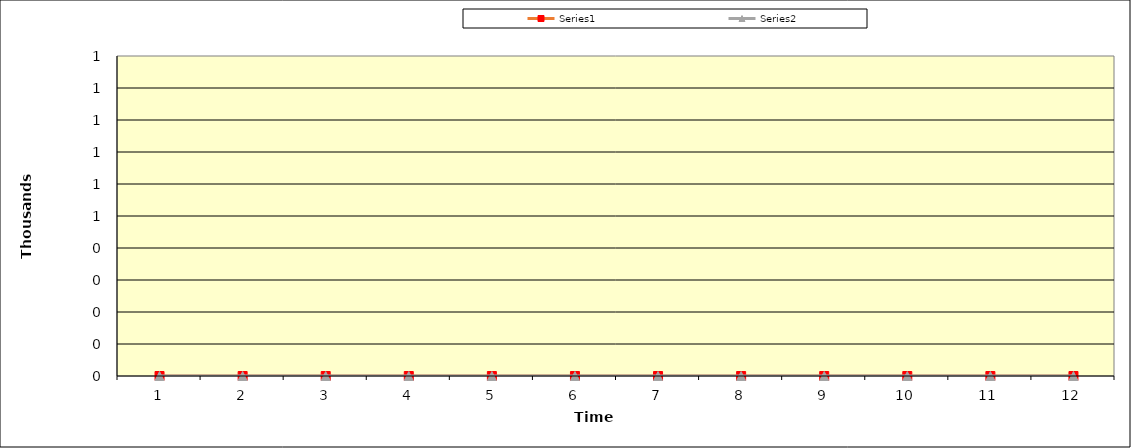
| Category | Series 1 | Series 2 |
|---|---|---|
| 0 | 0 | 0 |
| 1 | 0 | 0 |
| 2 | 0 | 0 |
| 3 | 0 | 0 |
| 4 | 0 | 0 |
| 5 | 0 | 0 |
| 6 | 0 | 0 |
| 7 | 0 | 0 |
| 8 | 0 | 0 |
| 9 | 0 | 0 |
| 10 | 0 | 0 |
| 11 | 0 | 0 |